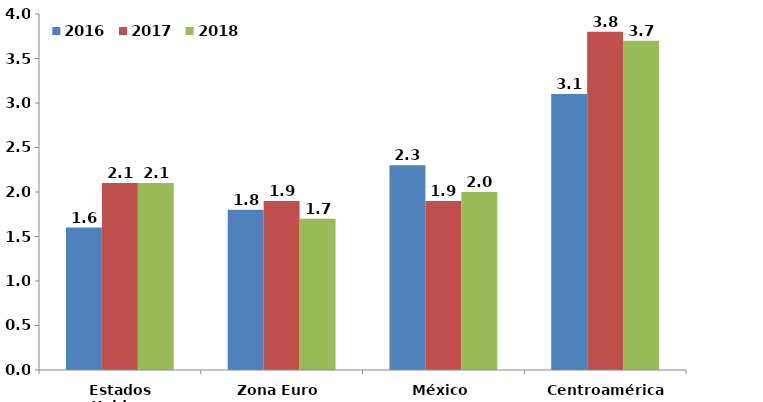
| Category | 2016 | 2017 | 2018 |
|---|---|---|---|
| Estados Unidos  | 1.6 | 2.1 | 2.1 |
| Zona Euro  | 1.8 | 1.9 | 1.7 |
| México | 2.3 | 1.9 | 2 |
| Centroamérica | 3.1 | 3.8 | 3.7 |